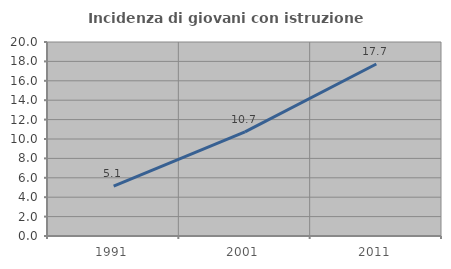
| Category | Incidenza di giovani con istruzione universitaria |
|---|---|
| 1991.0 | 5.143 |
| 2001.0 | 10.734 |
| 2011.0 | 17.73 |